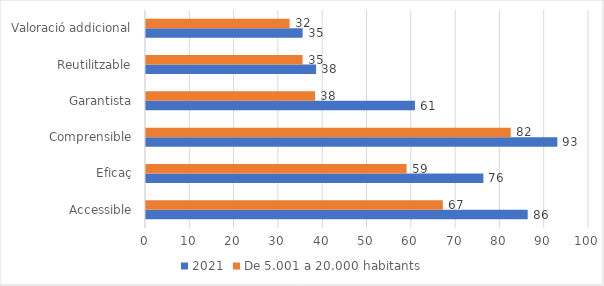
| Category | 2021 | De 5.001 a 20.000 habitants |
|---|---|---|
| Accessible | 86.161 | 67.004 |
| Eficaç | 76.161 | 58.828 |
| Comprensible | 92.857 | 82.328 |
| Garantista | 60.714 | 38.147 |
| Reutilitzable | 38.393 | 35.345 |
| Valoració addicional | 35.357 | 32.414 |